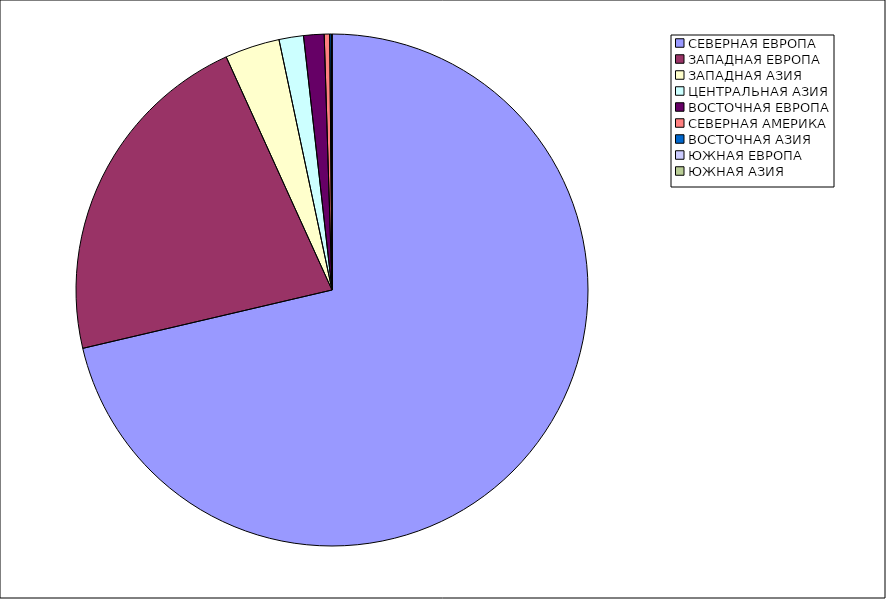
| Category | Оборот |
|---|---|
| СЕВЕРНАЯ ЕВРОПА | 71.339 |
| ЗАПАДНАЯ ЕВРОПА | 21.88 |
| ЗАПАДНАЯ АЗИЯ | 3.458 |
| ЦЕНТРАЛЬНАЯ АЗИЯ | 1.543 |
| ВОСТОЧНАЯ ЕВРОПА | 1.293 |
| СЕВЕРНАЯ АМЕРИКА | 0.344 |
| ВОСТОЧНАЯ АЗИЯ | 0.116 |
| ЮЖНАЯ ЕВРОПА | 0.025 |
| ЮЖНАЯ АЗИЯ | 0.001 |